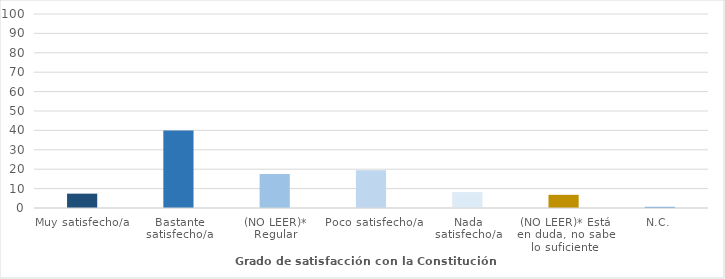
| Category | Series 0 |
|---|---|
| Muy satisfecho/a | 7.4 |
| Bastante satisfecho/a | 39.9 |
| (NO LEER)* Regular | 17.5 |
| Poco satisfecho/a | 19.5 |
| Nada satisfecho/a | 8.2 |
| (NO LEER)* Está en duda, no sabe lo suficiente | 6.8 |
| N.C. | 0.6 |